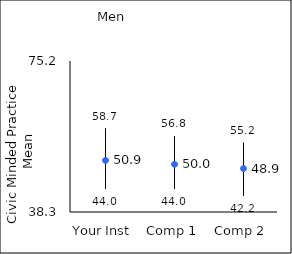
| Category | 25th percentile | 75th percentile | Mean |
|---|---|---|---|
| Your Inst | 44 | 58.7 | 50.91 |
| Comp 1 | 44 | 56.8 | 49.96 |
| Comp 2 | 42.2 | 55.2 | 48.92 |